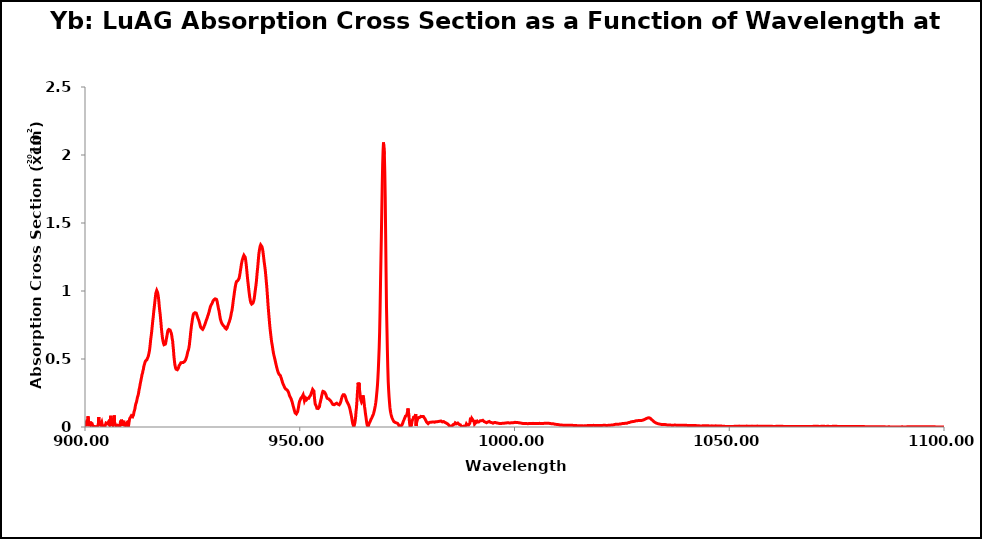
| Category | 175 K |
|---|---|
| 900.0 | 0.008 |
| 900.1 | 0.011 |
| 900.2 | 0.025 |
| 900.3 | 0.015 |
| 900.4 | 0.02 |
| 900.5 | 0.022 |
| 900.6 | 0.02 |
| 900.7 | 0.079 |
| 900.8 | 0.046 |
| 900.9 | 0.015 |
| 901.0 | 0.014 |
| 901.1 | 0.019 |
| 901.2 | 0.016 |
| 901.3 | 0.04 |
| 901.4 | 0.013 |
| 901.5 | 0.015 |
| 901.6 | 0.01 |
| 901.7 | 0.02 |
| 901.8 | 0.011 |
| 901.9 | 0.013 |
| 902.0 | 0.003 |
| 902.1 | 0.008 |
| 902.2 | 0.005 |
| 902.3 | 0.003 |
| 902.4 | 0.001 |
| 902.5 | 0.002 |
| 902.6 | 0.001 |
| 902.7 | 0.001 |
| 902.8 | 0 |
| 902.9 | 0.005 |
| 903.0 | 0.011 |
| 903.1 | 0.019 |
| 903.2 | 0.073 |
| 903.3 | 0.018 |
| 903.4 | 0.015 |
| 903.5 | 0.012 |
| 903.6 | 0.013 |
| 903.7 | 0.019 |
| 903.8 | 0.027 |
| 903.9 | 0.034 |
| 904.0 | 0.018 |
| 904.1 | 0.009 |
| 904.2 | 0.008 |
| 904.3 | 0.008 |
| 904.4 | 0.009 |
| 904.5 | 0.001 |
| 904.6 | 0.007 |
| 904.7 | 0.009 |
| 904.8 | 0.014 |
| 904.9 | 0.029 |
| 905.0 | 0.028 |
| 905.1 | 0.027 |
| 905.2 | 0.025 |
| 905.3 | 0.028 |
| 905.4 | 0.034 |
| 905.5 | 0.023 |
| 905.6 | 0.019 |
| 905.7 | 0.014 |
| 905.8 | 0.024 |
| 905.9 | 0.042 |
| 906.0 | 0.082 |
| 906.1 | 0.019 |
| 906.2 | 0.015 |
| 906.3 | 0.016 |
| 906.4 | 0.024 |
| 906.5 | 0.014 |
| 906.6 | 0.024 |
| 906.7 | 0.029 |
| 906.8 | 0.085 |
| 906.9 | 0.035 |
| 907.0 | 0.02 |
| 907.1 | 0.018 |
| 907.2 | 0.008 |
| 907.3 | 0.013 |
| 907.4 | 0.008 |
| 907.5 | 0.014 |
| 907.6 | 0.016 |
| 907.7 | 0.019 |
| 907.8 | 0.01 |
| 907.9 | 0.009 |
| 908.0 | 0.007 |
| 908.1 | 0.008 |
| 908.2 | 0.012 |
| 908.3 | 0.046 |
| 908.4 | 0.008 |
| 908.5 | 0.054 |
| 908.6 | 0.051 |
| 908.7 | 0.008 |
| 908.8 | 0.008 |
| 908.9 | 0.008 |
| 909.0 | 0.046 |
| 909.1 | 0.017 |
| 909.2 | 0.014 |
| 909.3 | 0.01 |
| 909.4 | 0.01 |
| 909.5 | 0.02 |
| 909.6 | 0.025 |
| 909.7 | 0.028 |
| 909.8 | 0.016 |
| 909.9 | 0.014 |
| 910.0 | 0.015 |
| 910.1 | 0.002 |
| 910.2 | 0 |
| 910.3 | 0.044 |
| 910.4 | 0.062 |
| 910.5 | 0.063 |
| 910.6 | 0.072 |
| 910.7 | 0.074 |
| 910.8 | 0.083 |
| 910.9 | 0.083 |
| 911.0 | 0.083 |
| 911.1 | 0.076 |
| 911.2 | 0.076 |
| 911.3 | 0.09 |
| 911.4 | 0.11 |
| 911.5 | 0.119 |
| 911.6 | 0.131 |
| 911.7 | 0.15 |
| 911.8 | 0.167 |
| 911.9 | 0.176 |
| 912.0 | 0.185 |
| 912.1 | 0.202 |
| 912.2 | 0.218 |
| 912.3 | 0.226 |
| 912.4 | 0.238 |
| 912.5 | 0.254 |
| 912.6 | 0.276 |
| 912.7 | 0.288 |
| 912.8 | 0.307 |
| 912.9 | 0.323 |
| 913.0 | 0.339 |
| 913.1 | 0.354 |
| 913.2 | 0.372 |
| 913.3 | 0.389 |
| 913.4 | 0.397 |
| 913.5 | 0.414 |
| 913.6 | 0.426 |
| 913.7 | 0.446 |
| 913.8 | 0.457 |
| 913.9 | 0.468 |
| 914.0 | 0.478 |
| 914.1 | 0.486 |
| 914.2 | 0.486 |
| 914.3 | 0.488 |
| 914.4 | 0.494 |
| 914.5 | 0.503 |
| 914.6 | 0.51 |
| 914.7 | 0.517 |
| 914.8 | 0.53 |
| 914.9 | 0.544 |
| 915.0 | 0.559 |
| 915.1 | 0.583 |
| 915.2 | 0.613 |
| 915.3 | 0.645 |
| 915.4 | 0.668 |
| 915.5 | 0.693 |
| 915.6 | 0.724 |
| 915.7 | 0.755 |
| 915.8 | 0.787 |
| 915.9 | 0.812 |
| 916.0 | 0.848 |
| 916.1 | 0.874 |
| 916.2 | 0.902 |
| 916.3 | 0.931 |
| 916.4 | 0.959 |
| 916.5 | 0.985 |
| 916.6 | 0.994 |
| 916.7 | 1.004 |
| 916.8 | 0.999 |
| 916.9 | 0.989 |
| 917.0 | 0.973 |
| 917.1 | 0.951 |
| 917.2 | 0.922 |
| 917.3 | 0.885 |
| 917.4 | 0.856 |
| 917.5 | 0.83 |
| 917.6 | 0.795 |
| 917.7 | 0.761 |
| 917.8 | 0.721 |
| 917.9 | 0.693 |
| 918.0 | 0.665 |
| 918.1 | 0.642 |
| 918.2 | 0.627 |
| 918.3 | 0.613 |
| 918.4 | 0.605 |
| 918.5 | 0.602 |
| 918.6 | 0.602 |
| 918.7 | 0.609 |
| 918.8 | 0.619 |
| 918.9 | 0.64 |
| 919.0 | 0.656 |
| 919.1 | 0.674 |
| 919.2 | 0.692 |
| 919.3 | 0.709 |
| 919.4 | 0.714 |
| 919.5 | 0.717 |
| 919.6 | 0.72 |
| 919.7 | 0.717 |
| 919.8 | 0.713 |
| 919.9 | 0.707 |
| 920.0 | 0.707 |
| 920.1 | 0.689 |
| 920.2 | 0.673 |
| 920.3 | 0.649 |
| 920.4 | 0.634 |
| 920.5 | 0.597 |
| 920.6 | 0.565 |
| 920.7 | 0.522 |
| 920.8 | 0.492 |
| 920.9 | 0.464 |
| 921.0 | 0.446 |
| 921.1 | 0.434 |
| 921.2 | 0.425 |
| 921.3 | 0.419 |
| 921.4 | 0.419 |
| 921.5 | 0.421 |
| 921.6 | 0.426 |
| 921.7 | 0.43 |
| 921.8 | 0.439 |
| 921.9 | 0.451 |
| 922.0 | 0.458 |
| 922.1 | 0.46 |
| 922.2 | 0.462 |
| 922.3 | 0.472 |
| 922.4 | 0.478 |
| 922.5 | 0.479 |
| 922.6 | 0.473 |
| 922.7 | 0.477 |
| 922.8 | 0.473 |
| 922.9 | 0.474 |
| 923.0 | 0.473 |
| 923.1 | 0.481 |
| 923.2 | 0.483 |
| 923.3 | 0.487 |
| 923.4 | 0.492 |
| 923.5 | 0.501 |
| 923.6 | 0.508 |
| 923.7 | 0.521 |
| 923.8 | 0.535 |
| 923.9 | 0.549 |
| 924.0 | 0.559 |
| 924.1 | 0.568 |
| 924.2 | 0.584 |
| 924.3 | 0.603 |
| 924.4 | 0.635 |
| 924.5 | 0.66 |
| 924.6 | 0.694 |
| 924.7 | 0.72 |
| 924.8 | 0.748 |
| 924.9 | 0.767 |
| 925.0 | 0.79 |
| 925.1 | 0.808 |
| 925.2 | 0.826 |
| 925.3 | 0.833 |
| 925.4 | 0.835 |
| 925.5 | 0.838 |
| 925.6 | 0.84 |
| 925.7 | 0.845 |
| 925.8 | 0.843 |
| 925.9 | 0.837 |
| 926.0 | 0.831 |
| 926.1 | 0.819 |
| 926.2 | 0.809 |
| 926.3 | 0.8 |
| 926.4 | 0.792 |
| 926.5 | 0.784 |
| 926.6 | 0.773 |
| 926.7 | 0.762 |
| 926.8 | 0.749 |
| 926.9 | 0.737 |
| 927.0 | 0.731 |
| 927.1 | 0.726 |
| 927.2 | 0.721 |
| 927.3 | 0.719 |
| 927.4 | 0.718 |
| 927.5 | 0.722 |
| 927.6 | 0.728 |
| 927.7 | 0.738 |
| 927.8 | 0.743 |
| 927.9 | 0.752 |
| 928.0 | 0.759 |
| 928.1 | 0.772 |
| 928.2 | 0.779 |
| 928.3 | 0.79 |
| 928.4 | 0.797 |
| 928.5 | 0.808 |
| 928.6 | 0.818 |
| 928.7 | 0.826 |
| 928.8 | 0.838 |
| 928.9 | 0.847 |
| 929.0 | 0.863 |
| 929.1 | 0.872 |
| 929.2 | 0.886 |
| 929.3 | 0.892 |
| 929.4 | 0.899 |
| 929.5 | 0.901 |
| 929.6 | 0.91 |
| 929.7 | 0.918 |
| 929.8 | 0.926 |
| 929.9 | 0.932 |
| 930.0 | 0.935 |
| 930.1 | 0.942 |
| 930.2 | 0.941 |
| 930.3 | 0.942 |
| 930.4 | 0.942 |
| 930.5 | 0.942 |
| 930.6 | 0.939 |
| 930.7 | 0.931 |
| 930.8 | 0.918 |
| 930.9 | 0.901 |
| 931.0 | 0.884 |
| 931.1 | 0.867 |
| 931.2 | 0.856 |
| 931.3 | 0.834 |
| 931.4 | 0.816 |
| 931.5 | 0.796 |
| 931.6 | 0.785 |
| 931.7 | 0.775 |
| 931.8 | 0.765 |
| 931.9 | 0.759 |
| 932.0 | 0.755 |
| 932.1 | 0.752 |
| 932.2 | 0.745 |
| 932.3 | 0.744 |
| 932.4 | 0.741 |
| 932.5 | 0.737 |
| 932.6 | 0.728 |
| 932.7 | 0.723 |
| 932.8 | 0.722 |
| 932.9 | 0.721 |
| 933.0 | 0.725 |
| 933.1 | 0.729 |
| 933.2 | 0.741 |
| 933.3 | 0.748 |
| 933.4 | 0.756 |
| 933.5 | 0.766 |
| 933.6 | 0.774 |
| 933.7 | 0.785 |
| 933.8 | 0.794 |
| 933.9 | 0.808 |
| 934.0 | 0.824 |
| 934.1 | 0.842 |
| 934.2 | 0.854 |
| 934.3 | 0.874 |
| 934.4 | 0.896 |
| 934.5 | 0.924 |
| 934.6 | 0.946 |
| 934.7 | 0.968 |
| 934.8 | 0.993 |
| 934.9 | 1.013 |
| 935.0 | 1.033 |
| 935.1 | 1.049 |
| 935.2 | 1.062 |
| 935.3 | 1.07 |
| 935.4 | 1.074 |
| 935.5 | 1.076 |
| 935.6 | 1.077 |
| 935.7 | 1.076 |
| 935.8 | 1.083 |
| 935.9 | 1.095 |
| 936.0 | 1.113 |
| 936.1 | 1.13 |
| 936.2 | 1.153 |
| 936.3 | 1.172 |
| 936.4 | 1.194 |
| 936.5 | 1.21 |
| 936.6 | 1.226 |
| 936.7 | 1.234 |
| 936.8 | 1.247 |
| 936.9 | 1.255 |
| 937.0 | 1.263 |
| 937.1 | 1.263 |
| 937.2 | 1.26 |
| 937.3 | 1.248 |
| 937.4 | 1.229 |
| 937.5 | 1.204 |
| 937.6 | 1.175 |
| 937.7 | 1.14 |
| 937.8 | 1.107 |
| 937.9 | 1.076 |
| 938.0 | 1.05 |
| 938.1 | 1.02 |
| 938.2 | 0.992 |
| 938.3 | 0.968 |
| 938.4 | 0.946 |
| 938.5 | 0.928 |
| 938.6 | 0.915 |
| 938.7 | 0.908 |
| 938.8 | 0.904 |
| 938.9 | 0.903 |
| 939.0 | 0.905 |
| 939.1 | 0.911 |
| 939.2 | 0.919 |
| 939.3 | 0.93 |
| 939.4 | 0.946 |
| 939.5 | 0.968 |
| 939.6 | 0.995 |
| 939.7 | 1.018 |
| 939.8 | 1.041 |
| 939.9 | 1.07 |
| 940.0 | 1.106 |
| 940.1 | 1.142 |
| 940.2 | 1.171 |
| 940.3 | 1.207 |
| 940.4 | 1.244 |
| 940.5 | 1.278 |
| 940.6 | 1.298 |
| 940.7 | 1.316 |
| 940.8 | 1.331 |
| 940.9 | 1.339 |
| 941.0 | 1.338 |
| 941.1 | 1.333 |
| 941.2 | 1.326 |
| 941.3 | 1.314 |
| 941.4 | 1.296 |
| 941.5 | 1.272 |
| 941.6 | 1.245 |
| 941.7 | 1.218 |
| 941.8 | 1.194 |
| 941.9 | 1.172 |
| 942.0 | 1.143 |
| 942.1 | 1.111 |
| 942.2 | 1.074 |
| 942.3 | 1.039 |
| 942.4 | 0.997 |
| 942.5 | 0.954 |
| 942.6 | 0.904 |
| 942.7 | 0.865 |
| 942.8 | 0.826 |
| 942.9 | 0.79 |
| 943.0 | 0.751 |
| 943.1 | 0.72 |
| 943.2 | 0.693 |
| 943.3 | 0.665 |
| 943.4 | 0.638 |
| 943.5 | 0.617 |
| 943.6 | 0.599 |
| 943.7 | 0.578 |
| 943.8 | 0.558 |
| 943.9 | 0.54 |
| 944.0 | 0.525 |
| 944.1 | 0.513 |
| 944.2 | 0.499 |
| 944.3 | 0.486 |
| 944.4 | 0.47 |
| 944.5 | 0.457 |
| 944.6 | 0.444 |
| 944.7 | 0.432 |
| 944.8 | 0.419 |
| 944.9 | 0.408 |
| 945.0 | 0.399 |
| 945.1 | 0.393 |
| 945.2 | 0.386 |
| 945.3 | 0.385 |
| 945.4 | 0.381 |
| 945.5 | 0.377 |
| 945.6 | 0.367 |
| 945.7 | 0.358 |
| 945.8 | 0.348 |
| 945.9 | 0.338 |
| 946.0 | 0.326 |
| 946.1 | 0.318 |
| 946.2 | 0.311 |
| 946.3 | 0.304 |
| 946.4 | 0.297 |
| 946.5 | 0.289 |
| 946.6 | 0.286 |
| 946.7 | 0.28 |
| 946.8 | 0.276 |
| 946.9 | 0.273 |
| 947.0 | 0.274 |
| 947.1 | 0.271 |
| 947.2 | 0.266 |
| 947.3 | 0.259 |
| 947.4 | 0.253 |
| 947.5 | 0.243 |
| 947.6 | 0.232 |
| 947.7 | 0.225 |
| 947.8 | 0.22 |
| 947.9 | 0.214 |
| 948.0 | 0.206 |
| 948.1 | 0.196 |
| 948.2 | 0.188 |
| 948.3 | 0.176 |
| 948.4 | 0.163 |
| 948.5 | 0.151 |
| 948.6 | 0.14 |
| 948.7 | 0.127 |
| 948.8 | 0.117 |
| 948.9 | 0.105 |
| 949.0 | 0.104 |
| 949.1 | 0.1 |
| 949.2 | 0.096 |
| 949.3 | 0.092 |
| 949.4 | 0.095 |
| 949.5 | 0.112 |
| 949.6 | 0.127 |
| 949.7 | 0.144 |
| 949.8 | 0.165 |
| 949.9 | 0.181 |
| 950.0 | 0.192 |
| 950.1 | 0.198 |
| 950.2 | 0.206 |
| 950.3 | 0.214 |
| 950.4 | 0.22 |
| 950.5 | 0.22 |
| 950.6 | 0.224 |
| 950.7 | 0.228 |
| 950.8 | 0.237 |
| 950.9 | 0.224 |
| 951.0 | 0.207 |
| 951.1 | 0.192 |
| 951.2 | 0.199 |
| 951.3 | 0.205 |
| 951.4 | 0.212 |
| 951.5 | 0.207 |
| 951.6 | 0.202 |
| 951.7 | 0.2 |
| 951.8 | 0.21 |
| 951.9 | 0.211 |
| 952.0 | 0.213 |
| 952.1 | 0.211 |
| 952.2 | 0.22 |
| 952.3 | 0.224 |
| 952.4 | 0.226 |
| 952.5 | 0.232 |
| 952.6 | 0.24 |
| 952.7 | 0.247 |
| 952.8 | 0.259 |
| 952.9 | 0.266 |
| 953.0 | 0.276 |
| 953.1 | 0.269 |
| 953.2 | 0.271 |
| 953.3 | 0.263 |
| 953.4 | 0.225 |
| 953.5 | 0.193 |
| 953.6 | 0.169 |
| 953.7 | 0.169 |
| 953.8 | 0.156 |
| 953.9 | 0.148 |
| 954.0 | 0.137 |
| 954.1 | 0.137 |
| 954.2 | 0.134 |
| 954.3 | 0.136 |
| 954.4 | 0.132 |
| 954.5 | 0.143 |
| 954.6 | 0.15 |
| 954.7 | 0.173 |
| 954.8 | 0.183 |
| 954.9 | 0.199 |
| 955.0 | 0.209 |
| 955.1 | 0.228 |
| 955.2 | 0.24 |
| 955.3 | 0.254 |
| 955.4 | 0.262 |
| 955.5 | 0.267 |
| 955.6 | 0.265 |
| 955.7 | 0.259 |
| 955.8 | 0.255 |
| 955.9 | 0.25 |
| 956.0 | 0.244 |
| 956.1 | 0.237 |
| 956.2 | 0.225 |
| 956.3 | 0.219 |
| 956.4 | 0.211 |
| 956.5 | 0.209 |
| 956.6 | 0.208 |
| 956.7 | 0.207 |
| 956.8 | 0.202 |
| 956.9 | 0.2 |
| 957.0 | 0.198 |
| 957.1 | 0.198 |
| 957.2 | 0.193 |
| 957.3 | 0.188 |
| 957.4 | 0.183 |
| 957.5 | 0.176 |
| 957.6 | 0.171 |
| 957.7 | 0.166 |
| 957.8 | 0.165 |
| 957.9 | 0.163 |
| 958.0 | 0.164 |
| 958.1 | 0.163 |
| 958.2 | 0.167 |
| 958.3 | 0.17 |
| 958.4 | 0.175 |
| 958.5 | 0.174 |
| 958.6 | 0.175 |
| 958.7 | 0.169 |
| 958.8 | 0.171 |
| 958.9 | 0.167 |
| 959.0 | 0.167 |
| 959.1 | 0.163 |
| 959.2 | 0.163 |
| 959.3 | 0.168 |
| 959.4 | 0.173 |
| 959.5 | 0.183 |
| 959.6 | 0.191 |
| 959.7 | 0.206 |
| 959.8 | 0.215 |
| 959.9 | 0.225 |
| 960.0 | 0.23 |
| 960.1 | 0.237 |
| 960.2 | 0.24 |
| 960.3 | 0.239 |
| 960.4 | 0.236 |
| 960.5 | 0.231 |
| 960.6 | 0.225 |
| 960.7 | 0.214 |
| 960.8 | 0.204 |
| 960.9 | 0.193 |
| 961.0 | 0.185 |
| 961.1 | 0.181 |
| 961.2 | 0.174 |
| 961.3 | 0.168 |
| 961.4 | 0.161 |
| 961.5 | 0.153 |
| 961.6 | 0.144 |
| 961.7 | 0.13 |
| 961.8 | 0.115 |
| 961.9 | 0.1 |
| 962.0 | 0.085 |
| 962.1 | 0.068 |
| 962.2 | 0.048 |
| 962.3 | 0.031 |
| 962.4 | 0.019 |
| 962.5 | 0.009 |
| 962.6 | 0 |
| 962.7 | 0.013 |
| 962.8 | 0.025 |
| 962.9 | 0.044 |
| 963.0 | 0.071 |
| 963.1 | 0.112 |
| 963.2 | 0.14 |
| 963.3 | 0.183 |
| 963.4 | 0.238 |
| 963.5 | 0.282 |
| 963.6 | 0.326 |
| 963.7 | 0.306 |
| 963.8 | 0.325 |
| 963.9 | 0.278 |
| 964.0 | 0.253 |
| 964.1 | 0.225 |
| 964.2 | 0.201 |
| 964.3 | 0.191 |
| 964.4 | 0.182 |
| 964.5 | 0.184 |
| 964.6 | 0.194 |
| 964.7 | 0.232 |
| 964.8 | 0.237 |
| 964.9 | 0.203 |
| 965.0 | 0.174 |
| 965.1 | 0.147 |
| 965.2 | 0.125 |
| 965.3 | 0.097 |
| 965.4 | 0.078 |
| 965.5 | 0.053 |
| 965.6 | 0.03 |
| 965.7 | 0.015 |
| 965.8 | 0.008 |
| 965.9 | 0.001 |
| 966.0 | 0.008 |
| 966.1 | 0.02 |
| 966.2 | 0.029 |
| 966.3 | 0.035 |
| 966.4 | 0.042 |
| 966.5 | 0.049 |
| 966.6 | 0.057 |
| 966.7 | 0.063 |
| 966.8 | 0.069 |
| 966.9 | 0.076 |
| 967.0 | 0.083 |
| 967.1 | 0.091 |
| 967.2 | 0.1 |
| 967.3 | 0.113 |
| 967.4 | 0.125 |
| 967.5 | 0.142 |
| 967.6 | 0.159 |
| 967.7 | 0.179 |
| 967.8 | 0.205 |
| 967.9 | 0.237 |
| 968.0 | 0.271 |
| 968.1 | 0.309 |
| 968.2 | 0.363 |
| 968.3 | 0.425 |
| 968.4 | 0.505 |
| 968.5 | 0.588 |
| 968.6 | 0.701 |
| 968.7 | 0.857 |
| 968.8 | 1.049 |
| 968.9 | 1.227 |
| 969.0 | 1.4 |
| 969.1 | 1.586 |
| 969.2 | 1.77 |
| 969.3 | 1.926 |
| 969.4 | 2.03 |
| 969.5 | 2.092 |
| 969.6 | 2.092 |
| 969.7 | 2.004 |
| 969.8 | 1.876 |
| 969.9 | 1.693 |
| 970.0 | 1.417 |
| 970.1 | 1.134 |
| 970.2 | 0.879 |
| 970.3 | 0.723 |
| 970.4 | 0.566 |
| 970.5 | 0.437 |
| 970.6 | 0.333 |
| 970.7 | 0.271 |
| 970.8 | 0.221 |
| 970.9 | 0.179 |
| 971.0 | 0.142 |
| 971.1 | 0.117 |
| 971.2 | 0.101 |
| 971.3 | 0.087 |
| 971.4 | 0.075 |
| 971.5 | 0.066 |
| 971.6 | 0.059 |
| 971.7 | 0.053 |
| 971.8 | 0.046 |
| 971.9 | 0.041 |
| 972.0 | 0.038 |
| 972.1 | 0.035 |
| 972.2 | 0.033 |
| 972.3 | 0.032 |
| 972.4 | 0.031 |
| 972.5 | 0.03 |
| 972.6 | 0.03 |
| 972.7 | 0.029 |
| 972.8 | 0.027 |
| 972.9 | 0.022 |
| 973.0 | 0.017 |
| 973.1 | 0.01 |
| 973.2 | 0.002 |
| 973.3 | 0.002 |
| 973.4 | 0.003 |
| 973.5 | 0.005 |
| 973.6 | 0.009 |
| 973.7 | 0.013 |
| 973.8 | 0.016 |
| 973.9 | 0.022 |
| 974.0 | 0.029 |
| 974.1 | 0.041 |
| 974.2 | 0.046 |
| 974.3 | 0.055 |
| 974.4 | 0.06 |
| 974.5 | 0.071 |
| 974.6 | 0.08 |
| 974.7 | 0.085 |
| 974.8 | 0.086 |
| 974.9 | 0.086 |
| 975.0 | 0.1 |
| 975.1 | 0.112 |
| 975.2 | 0.136 |
| 975.3 | 0.111 |
| 975.4 | 0.093 |
| 975.5 | 0.052 |
| 975.6 | 0.022 |
| 975.7 | 0.001 |
| 975.8 | 0.002 |
| 975.9 | 0.001 |
| 976.0 | 0.011 |
| 976.1 | 0.033 |
| 976.2 | 0.05 |
| 976.3 | 0.055 |
| 976.4 | 0.06 |
| 976.5 | 0.072 |
| 976.6 | 0.077 |
| 976.7 | 0.077 |
| 976.8 | 0.075 |
| 976.9 | 0.085 |
| 977.0 | 0.095 |
| 977.1 | 0.007 |
| 977.2 | 0.03 |
| 977.3 | 0.045 |
| 977.4 | 0.053 |
| 977.5 | 0.06 |
| 977.6 | 0.069 |
| 977.7 | 0.068 |
| 977.8 | 0.071 |
| 977.9 | 0.07 |
| 978.0 | 0.072 |
| 978.1 | 0.073 |
| 978.2 | 0.078 |
| 978.3 | 0.077 |
| 978.4 | 0.08 |
| 978.5 | 0.077 |
| 978.6 | 0.08 |
| 978.7 | 0.08 |
| 978.8 | 0.077 |
| 978.9 | 0.074 |
| 979.0 | 0.067 |
| 979.1 | 0.065 |
| 979.2 | 0.058 |
| 979.3 | 0.053 |
| 979.4 | 0.044 |
| 979.5 | 0.038 |
| 979.6 | 0.033 |
| 979.7 | 0.029 |
| 979.8 | 0.027 |
| 979.9 | 0.025 |
| 980.0 | 0.026 |
| 980.1 | 0.03 |
| 980.2 | 0.034 |
| 980.3 | 0.035 |
| 980.4 | 0.034 |
| 980.5 | 0.035 |
| 980.6 | 0.037 |
| 980.7 | 0.036 |
| 980.8 | 0.037 |
| 980.9 | 0.037 |
| 981.0 | 0.038 |
| 981.1 | 0.037 |
| 981.2 | 0.036 |
| 981.3 | 0.035 |
| 981.4 | 0.035 |
| 981.5 | 0.035 |
| 981.6 | 0.037 |
| 981.7 | 0.039 |
| 981.8 | 0.039 |
| 981.9 | 0.039 |
| 982.0 | 0.039 |
| 982.1 | 0.039 |
| 982.2 | 0.038 |
| 982.3 | 0.04 |
| 982.4 | 0.042 |
| 982.5 | 0.044 |
| 982.6 | 0.042 |
| 982.7 | 0.044 |
| 982.8 | 0.045 |
| 982.9 | 0.044 |
| 983.0 | 0.04 |
| 983.1 | 0.039 |
| 983.2 | 0.037 |
| 983.3 | 0.039 |
| 983.4 | 0.038 |
| 983.5 | 0.04 |
| 983.6 | 0.039 |
| 983.7 | 0.036 |
| 983.8 | 0.034 |
| 983.9 | 0.032 |
| 984.0 | 0.032 |
| 984.1 | 0.029 |
| 984.2 | 0.029 |
| 984.3 | 0.027 |
| 984.4 | 0.023 |
| 984.5 | 0.02 |
| 984.6 | 0.017 |
| 984.7 | 0.015 |
| 984.8 | 0.012 |
| 984.9 | 0.006 |
| 985.0 | 0.003 |
| 985.1 | 0.004 |
| 985.2 | 0.006 |
| 985.3 | 0.01 |
| 985.4 | 0.006 |
| 985.5 | 0.009 |
| 985.6 | 0.01 |
| 985.7 | 0.018 |
| 985.8 | 0.018 |
| 985.9 | 0.018 |
| 986.0 | 0.02 |
| 986.1 | 0.024 |
| 986.2 | 0.031 |
| 986.3 | 0.029 |
| 986.4 | 0.03 |
| 986.5 | 0.024 |
| 986.6 | 0.028 |
| 986.7 | 0.025 |
| 986.8 | 0.029 |
| 986.9 | 0.026 |
| 987.0 | 0.025 |
| 987.1 | 0.019 |
| 987.2 | 0.019 |
| 987.3 | 0.02 |
| 987.4 | 0.016 |
| 987.5 | 0.012 |
| 987.6 | 0.006 |
| 987.7 | 0 |
| 987.8 | 0.002 |
| 987.9 | 0.002 |
| 988.0 | 0.008 |
| 988.1 | 0.009 |
| 988.2 | 0.006 |
| 988.3 | 0.004 |
| 988.4 | 0.001 |
| 988.5 | 0.002 |
| 988.6 | 0.006 |
| 988.7 | 0.015 |
| 988.8 | 0.023 |
| 988.9 | 0.019 |
| 989.0 | 0.014 |
| 989.1 | 0.009 |
| 989.2 | 0.012 |
| 989.3 | 0.015 |
| 989.4 | 0.016 |
| 989.5 | 0.016 |
| 989.6 | 0.028 |
| 989.7 | 0.056 |
| 989.8 | 0.069 |
| 989.9 | 0.063 |
| 990.0 | 0.039 |
| 990.1 | 0.061 |
| 990.2 | 0.064 |
| 990.3 | 0.052 |
| 990.4 | 0.048 |
| 990.5 | 0.05 |
| 990.6 | 0.037 |
| 990.7 | 0.021 |
| 990.8 | 0.02 |
| 990.9 | 0.021 |
| 991.0 | 0.032 |
| 991.1 | 0.052 |
| 991.2 | 0.044 |
| 991.3 | 0.04 |
| 991.4 | 0.036 |
| 991.5 | 0.043 |
| 991.6 | 0.039 |
| 991.7 | 0.037 |
| 991.8 | 0.036 |
| 991.9 | 0.043 |
| 992.0 | 0.046 |
| 992.1 | 0.048 |
| 992.2 | 0.046 |
| 992.3 | 0.046 |
| 992.4 | 0.049 |
| 992.5 | 0.051 |
| 992.6 | 0.049 |
| 992.7 | 0.044 |
| 992.8 | 0.042 |
| 992.9 | 0.04 |
| 993.0 | 0.041 |
| 993.1 | 0.037 |
| 993.2 | 0.036 |
| 993.3 | 0.034 |
| 993.4 | 0.033 |
| 993.5 | 0.032 |
| 993.6 | 0.033 |
| 993.7 | 0.035 |
| 993.8 | 0.037 |
| 993.9 | 0.039 |
| 994.0 | 0.04 |
| 994.1 | 0.041 |
| 994.2 | 0.039 |
| 994.3 | 0.038 |
| 994.4 | 0.034 |
| 994.5 | 0.032 |
| 994.6 | 0.032 |
| 994.7 | 0.032 |
| 994.8 | 0.032 |
| 994.9 | 0.029 |
| 995.0 | 0.028 |
| 995.1 | 0.029 |
| 995.2 | 0.032 |
| 995.3 | 0.033 |
| 995.4 | 0.032 |
| 995.5 | 0.033 |
| 995.6 | 0.033 |
| 995.7 | 0.034 |
| 995.8 | 0.031 |
| 995.9 | 0.029 |
| 996.0 | 0.028 |
| 996.1 | 0.027 |
| 996.2 | 0.028 |
| 996.3 | 0.027 |
| 996.4 | 0.026 |
| 996.5 | 0.026 |
| 996.6 | 0.027 |
| 996.7 | 0.026 |
| 996.8 | 0.026 |
| 996.9 | 0.026 |
| 997.0 | 0.027 |
| 997.1 | 0.027 |
| 997.2 | 0.027 |
| 997.3 | 0.028 |
| 997.4 | 0.028 |
| 997.5 | 0.03 |
| 997.6 | 0.029 |
| 997.7 | 0.028 |
| 997.8 | 0.028 |
| 997.9 | 0.029 |
| 998.0 | 0.029 |
| 998.1 | 0.03 |
| 998.2 | 0.031 |
| 998.3 | 0.031 |
| 998.4 | 0.031 |
| 998.5 | 0.031 |
| 998.6 | 0.031 |
| 998.7 | 0.029 |
| 998.8 | 0.029 |
| 998.9 | 0.029 |
| 999.0 | 0.031 |
| 999.1 | 0.031 |
| 999.2 | 0.031 |
| 999.3 | 0.031 |
| 999.4 | 0.031 |
| 999.5 | 0.032 |
| 999.6 | 0.033 |
| 999.7 | 0.033 |
| 999.8 | 0.032 |
| 999.9 | 0.033 |
| 1000.0 | 0.033 |
| 1000.1 | 0.034 |
| 1000.2 | 0.034 |
| 1000.3 | 0.034 |
| 1000.4 | 0.033 |
| 1000.5 | 0.033 |
| 1000.6 | 0.034 |
| 1000.7 | 0.033 |
| 1000.8 | 0.032 |
| 1000.9 | 0.031 |
| 1001.0 | 0.031 |
| 1001.1 | 0.031 |
| 1001.2 | 0.031 |
| 1001.3 | 0.03 |
| 1001.4 | 0.029 |
| 1001.5 | 0.029 |
| 1001.6 | 0.028 |
| 1001.7 | 0.027 |
| 1001.8 | 0.026 |
| 1001.9 | 0.026 |
| 1002.0 | 0.026 |
| 1002.1 | 0.026 |
| 1002.2 | 0.025 |
| 1002.3 | 0.025 |
| 1002.4 | 0.025 |
| 1002.5 | 0.026 |
| 1002.6 | 0.026 |
| 1002.7 | 0.026 |
| 1002.8 | 0.025 |
| 1002.9 | 0.025 |
| 1003.0 | 0.025 |
| 1003.1 | 0.024 |
| 1003.2 | 0.025 |
| 1003.3 | 0.025 |
| 1003.4 | 0.025 |
| 1003.5 | 0.025 |
| 1003.6 | 0.026 |
| 1003.7 | 0.026 |
| 1003.8 | 0.026 |
| 1003.9 | 0.026 |
| 1004.0 | 0.026 |
| 1004.1 | 0.025 |
| 1004.2 | 0.026 |
| 1004.3 | 0.027 |
| 1004.4 | 0.027 |
| 1004.5 | 0.027 |
| 1004.6 | 0.025 |
| 1004.7 | 0.025 |
| 1004.8 | 0.025 |
| 1004.9 | 0.026 |
| 1005.0 | 0.027 |
| 1005.1 | 0.027 |
| 1005.2 | 0.026 |
| 1005.3 | 0.026 |
| 1005.4 | 0.026 |
| 1005.5 | 0.026 |
| 1005.6 | 0.026 |
| 1005.7 | 0.027 |
| 1005.8 | 0.027 |
| 1005.9 | 0.026 |
| 1006.0 | 0.026 |
| 1006.1 | 0.025 |
| 1006.2 | 0.025 |
| 1006.3 | 0.025 |
| 1006.4 | 0.025 |
| 1006.5 | 0.025 |
| 1006.6 | 0.026 |
| 1006.7 | 0.026 |
| 1006.8 | 0.027 |
| 1006.9 | 0.027 |
| 1007.0 | 0.028 |
| 1007.1 | 0.028 |
| 1007.2 | 0.028 |
| 1007.3 | 0.028 |
| 1007.4 | 0.028 |
| 1007.5 | 0.028 |
| 1007.6 | 0.027 |
| 1007.7 | 0.028 |
| 1007.8 | 0.028 |
| 1007.9 | 0.028 |
| 1008.0 | 0.027 |
| 1008.1 | 0.027 |
| 1008.2 | 0.026 |
| 1008.3 | 0.026 |
| 1008.4 | 0.025 |
| 1008.5 | 0.025 |
| 1008.6 | 0.025 |
| 1008.7 | 0.025 |
| 1008.8 | 0.024 |
| 1008.9 | 0.024 |
| 1009.0 | 0.023 |
| 1009.1 | 0.023 |
| 1009.2 | 0.022 |
| 1009.3 | 0.021 |
| 1009.4 | 0.02 |
| 1009.5 | 0.02 |
| 1009.6 | 0.02 |
| 1009.7 | 0.019 |
| 1009.8 | 0.019 |
| 1009.9 | 0.019 |
| 1010.0 | 0.018 |
| 1010.1 | 0.018 |
| 1010.2 | 0.018 |
| 1010.3 | 0.017 |
| 1010.4 | 0.017 |
| 1010.5 | 0.015 |
| 1010.6 | 0.015 |
| 1010.7 | 0.014 |
| 1010.8 | 0.014 |
| 1010.9 | 0.014 |
| 1011.0 | 0.014 |
| 1011.1 | 0.014 |
| 1011.2 | 0.014 |
| 1011.3 | 0.014 |
| 1011.4 | 0.014 |
| 1011.5 | 0.013 |
| 1011.6 | 0.013 |
| 1011.7 | 0.013 |
| 1011.8 | 0.014 |
| 1011.9 | 0.014 |
| 1012.0 | 0.014 |
| 1012.1 | 0.013 |
| 1012.2 | 0.013 |
| 1012.3 | 0.014 |
| 1012.4 | 0.014 |
| 1012.5 | 0.014 |
| 1012.6 | 0.014 |
| 1012.7 | 0.014 |
| 1012.8 | 0.013 |
| 1012.9 | 0.013 |
| 1013.0 | 0.013 |
| 1013.1 | 0.013 |
| 1013.2 | 0.013 |
| 1013.3 | 0.013 |
| 1013.4 | 0.012 |
| 1013.5 | 0.012 |
| 1013.6 | 0.012 |
| 1013.7 | 0.012 |
| 1013.8 | 0.012 |
| 1013.9 | 0.011 |
| 1014.0 | 0.011 |
| 1014.1 | 0.011 |
| 1014.2 | 0.011 |
| 1014.3 | 0.011 |
| 1014.4 | 0.01 |
| 1014.5 | 0.01 |
| 1014.6 | 0.01 |
| 1014.7 | 0.01 |
| 1014.8 | 0.01 |
| 1014.9 | 0.01 |
| 1015.0 | 0.009 |
| 1015.1 | 0.009 |
| 1015.2 | 0.009 |
| 1015.3 | 0.009 |
| 1015.4 | 0.009 |
| 1015.5 | 0.01 |
| 1015.6 | 0.009 |
| 1015.7 | 0.009 |
| 1015.8 | 0.009 |
| 1015.9 | 0.009 |
| 1016.0 | 0.008 |
| 1016.1 | 0.008 |
| 1016.2 | 0.009 |
| 1016.3 | 0.009 |
| 1016.4 | 0.009 |
| 1016.5 | 0.009 |
| 1016.6 | 0.009 |
| 1016.7 | 0.009 |
| 1016.8 | 0.009 |
| 1016.9 | 0.01 |
| 1017.0 | 0.01 |
| 1017.1 | 0.011 |
| 1017.2 | 0.012 |
| 1017.3 | 0.012 |
| 1017.4 | 0.011 |
| 1017.5 | 0.011 |
| 1017.6 | 0.01 |
| 1017.7 | 0.011 |
| 1017.8 | 0.011 |
| 1017.9 | 0.011 |
| 1018.0 | 0.011 |
| 1018.1 | 0.011 |
| 1018.2 | 0.011 |
| 1018.3 | 0.012 |
| 1018.4 | 0.012 |
| 1018.5 | 0.012 |
| 1018.6 | 0.012 |
| 1018.7 | 0.012 |
| 1018.8 | 0.012 |
| 1018.9 | 0.011 |
| 1019.0 | 0.011 |
| 1019.1 | 0.011 |
| 1019.2 | 0.011 |
| 1019.3 | 0.011 |
| 1019.4 | 0.011 |
| 1019.5 | 0.011 |
| 1019.6 | 0.011 |
| 1019.7 | 0.012 |
| 1019.8 | 0.012 |
| 1019.9 | 0.012 |
| 1020.0 | 0.012 |
| 1020.1 | 0.012 |
| 1020.2 | 0.012 |
| 1020.3 | 0.012 |
| 1020.4 | 0.012 |
| 1020.5 | 0.012 |
| 1020.6 | 0.012 |
| 1020.7 | 0.012 |
| 1020.8 | 0.013 |
| 1020.9 | 0.013 |
| 1021.0 | 0.013 |
| 1021.1 | 0.012 |
| 1021.2 | 0.012 |
| 1021.3 | 0.012 |
| 1021.4 | 0.011 |
| 1021.5 | 0.011 |
| 1021.6 | 0.011 |
| 1021.7 | 0.012 |
| 1021.8 | 0.012 |
| 1021.9 | 0.013 |
| 1022.0 | 0.013 |
| 1022.1 | 0.013 |
| 1022.2 | 0.013 |
| 1022.3 | 0.013 |
| 1022.4 | 0.014 |
| 1022.5 | 0.014 |
| 1022.6 | 0.014 |
| 1022.7 | 0.015 |
| 1022.8 | 0.015 |
| 1022.9 | 0.015 |
| 1023.0 | 0.016 |
| 1023.1 | 0.016 |
| 1023.2 | 0.017 |
| 1023.3 | 0.019 |
| 1023.4 | 0.019 |
| 1023.5 | 0.02 |
| 1023.6 | 0.02 |
| 1023.7 | 0.02 |
| 1023.8 | 0.02 |
| 1023.9 | 0.02 |
| 1024.0 | 0.019 |
| 1024.1 | 0.02 |
| 1024.2 | 0.02 |
| 1024.3 | 0.021 |
| 1024.4 | 0.021 |
| 1024.5 | 0.022 |
| 1024.6 | 0.022 |
| 1024.7 | 0.022 |
| 1024.8 | 0.023 |
| 1024.9 | 0.024 |
| 1025.0 | 0.025 |
| 1025.1 | 0.025 |
| 1025.2 | 0.025 |
| 1025.3 | 0.026 |
| 1025.4 | 0.026 |
| 1025.5 | 0.027 |
| 1025.6 | 0.026 |
| 1025.7 | 0.027 |
| 1025.8 | 0.027 |
| 1025.9 | 0.028 |
| 1026.0 | 0.028 |
| 1026.1 | 0.028 |
| 1026.2 | 0.028 |
| 1026.3 | 0.029 |
| 1026.4 | 0.031 |
| 1026.5 | 0.032 |
| 1026.6 | 0.033 |
| 1026.7 | 0.033 |
| 1026.8 | 0.034 |
| 1026.9 | 0.035 |
| 1027.0 | 0.037 |
| 1027.1 | 0.038 |
| 1027.2 | 0.038 |
| 1027.3 | 0.038 |
| 1027.4 | 0.039 |
| 1027.5 | 0.04 |
| 1027.6 | 0.04 |
| 1027.7 | 0.04 |
| 1027.8 | 0.041 |
| 1027.9 | 0.042 |
| 1028.0 | 0.042 |
| 1028.1 | 0.044 |
| 1028.2 | 0.045 |
| 1028.3 | 0.046 |
| 1028.4 | 0.046 |
| 1028.5 | 0.046 |
| 1028.6 | 0.046 |
| 1028.7 | 0.047 |
| 1028.8 | 0.047 |
| 1028.9 | 0.048 |
| 1029.0 | 0.047 |
| 1029.1 | 0.047 |
| 1029.2 | 0.047 |
| 1029.3 | 0.048 |
| 1029.4 | 0.048 |
| 1029.5 | 0.048 |
| 1029.6 | 0.048 |
| 1029.7 | 0.049 |
| 1029.8 | 0.049 |
| 1029.9 | 0.05 |
| 1030.0 | 0.051 |
| 1030.1 | 0.053 |
| 1030.2 | 0.055 |
| 1030.3 | 0.056 |
| 1030.4 | 0.057 |
| 1030.5 | 0.058 |
| 1030.6 | 0.06 |
| 1030.7 | 0.062 |
| 1030.8 | 0.064 |
| 1030.9 | 0.065 |
| 1031.0 | 0.066 |
| 1031.1 | 0.067 |
| 1031.2 | 0.068 |
| 1031.3 | 0.068 |
| 1031.4 | 0.067 |
| 1031.5 | 0.066 |
| 1031.6 | 0.064 |
| 1031.7 | 0.062 |
| 1031.8 | 0.059 |
| 1031.9 | 0.056 |
| 1032.0 | 0.053 |
| 1032.1 | 0.05 |
| 1032.2 | 0.047 |
| 1032.3 | 0.043 |
| 1032.4 | 0.041 |
| 1032.5 | 0.039 |
| 1032.6 | 0.036 |
| 1032.7 | 0.034 |
| 1032.8 | 0.032 |
| 1032.9 | 0.03 |
| 1033.0 | 0.029 |
| 1033.1 | 0.028 |
| 1033.2 | 0.027 |
| 1033.3 | 0.026 |
| 1033.4 | 0.024 |
| 1033.5 | 0.023 |
| 1033.6 | 0.023 |
| 1033.7 | 0.022 |
| 1033.8 | 0.022 |
| 1033.9 | 0.021 |
| 1034.0 | 0.02 |
| 1034.1 | 0.02 |
| 1034.2 | 0.019 |
| 1034.3 | 0.018 |
| 1034.4 | 0.018 |
| 1034.5 | 0.018 |
| 1034.6 | 0.018 |
| 1034.7 | 0.018 |
| 1034.8 | 0.018 |
| 1034.9 | 0.018 |
| 1035.0 | 0.018 |
| 1035.1 | 0.017 |
| 1035.2 | 0.017 |
| 1035.3 | 0.017 |
| 1035.4 | 0.016 |
| 1035.5 | 0.016 |
| 1035.6 | 0.015 |
| 1035.7 | 0.015 |
| 1035.8 | 0.015 |
| 1035.9 | 0.015 |
| 1036.0 | 0.015 |
| 1036.1 | 0.015 |
| 1036.2 | 0.014 |
| 1036.3 | 0.014 |
| 1036.4 | 0.014 |
| 1036.5 | 0.014 |
| 1036.6 | 0.013 |
| 1036.7 | 0.013 |
| 1036.8 | 0.013 |
| 1036.9 | 0.013 |
| 1037.0 | 0.014 |
| 1037.1 | 0.014 |
| 1037.2 | 0.014 |
| 1037.3 | 0.014 |
| 1037.4 | 0.014 |
| 1037.5 | 0.014 |
| 1037.6 | 0.014 |
| 1037.7 | 0.014 |
| 1037.8 | 0.014 |
| 1037.9 | 0.014 |
| 1038.0 | 0.013 |
| 1038.1 | 0.013 |
| 1038.2 | 0.013 |
| 1038.3 | 0.013 |
| 1038.4 | 0.013 |
| 1038.5 | 0.013 |
| 1038.6 | 0.013 |
| 1038.7 | 0.012 |
| 1038.8 | 0.012 |
| 1038.9 | 0.012 |
| 1039.0 | 0.013 |
| 1039.1 | 0.013 |
| 1039.2 | 0.013 |
| 1039.3 | 0.013 |
| 1039.4 | 0.013 |
| 1039.5 | 0.013 |
| 1039.6 | 0.012 |
| 1039.7 | 0.012 |
| 1039.8 | 0.012 |
| 1039.9 | 0.013 |
| 1040.0 | 0.013 |
| 1040.1 | 0.012 |
| 1040.2 | 0.011 |
| 1040.3 | 0.011 |
| 1040.4 | 0.011 |
| 1040.5 | 0.012 |
| 1040.6 | 0.011 |
| 1040.7 | 0.011 |
| 1040.8 | 0.011 |
| 1040.9 | 0.011 |
| 1041.0 | 0.011 |
| 1041.1 | 0.011 |
| 1041.2 | 0.011 |
| 1041.3 | 0.011 |
| 1041.4 | 0.011 |
| 1041.5 | 0.011 |
| 1041.6 | 0.011 |
| 1041.7 | 0.01 |
| 1041.8 | 0.011 |
| 1041.9 | 0.011 |
| 1042.0 | 0.011 |
| 1042.1 | 0.01 |
| 1042.2 | 0.01 |
| 1042.3 | 0.01 |
| 1042.4 | 0.01 |
| 1042.5 | 0.009 |
| 1042.6 | 0.01 |
| 1042.7 | 0.009 |
| 1042.8 | 0.009 |
| 1042.9 | 0.009 |
| 1043.0 | 0.009 |
| 1043.1 | 0.008 |
| 1043.2 | 0.008 |
| 1043.3 | 0.008 |
| 1043.4 | 0.008 |
| 1043.5 | 0.008 |
| 1043.6 | 0.008 |
| 1043.7 | 0.008 |
| 1043.8 | 0.008 |
| 1043.9 | 0.009 |
| 1044.0 | 0.009 |
| 1044.1 | 0.009 |
| 1044.2 | 0.009 |
| 1044.3 | 0.009 |
| 1044.4 | 0.009 |
| 1044.5 | 0.009 |
| 1044.6 | 0.01 |
| 1044.7 | 0.009 |
| 1044.8 | 0.009 |
| 1044.9 | 0.009 |
| 1045.0 | 0.009 |
| 1045.1 | 0.009 |
| 1045.2 | 0.008 |
| 1045.3 | 0.008 |
| 1045.4 | 0.008 |
| 1045.5 | 0.008 |
| 1045.6 | 0.008 |
| 1045.7 | 0.008 |
| 1045.8 | 0.008 |
| 1045.9 | 0.009 |
| 1046.0 | 0.008 |
| 1046.1 | 0.008 |
| 1046.2 | 0.008 |
| 1046.3 | 0.008 |
| 1046.4 | 0.007 |
| 1046.5 | 0.008 |
| 1046.6 | 0.008 |
| 1046.7 | 0.008 |
| 1046.8 | 0.008 |
| 1046.9 | 0.008 |
| 1047.0 | 0.008 |
| 1047.1 | 0.008 |
| 1047.2 | 0.008 |
| 1047.3 | 0.007 |
| 1047.4 | 0.007 |
| 1047.5 | 0.006 |
| 1047.6 | 0.006 |
| 1047.7 | 0.007 |
| 1047.8 | 0.007 |
| 1047.9 | 0.007 |
| 1048.0 | 0.007 |
| 1048.1 | 0.007 |
| 1048.2 | 0.006 |
| 1048.3 | 0.006 |
| 1048.4 | 0.006 |
| 1048.5 | 0.006 |
| 1048.6 | 0.006 |
| 1048.7 | 0.006 |
| 1048.8 | 0.005 |
| 1048.9 | 0.005 |
| 1049.0 | 0.005 |
| 1049.1 | 0.004 |
| 1049.2 | 0.004 |
| 1049.3 | 0.004 |
| 1049.4 | 0.004 |
| 1049.5 | 0.004 |
| 1049.6 | 0.004 |
| 1049.7 | 0.004 |
| 1049.8 | 0.004 |
| 1049.9 | 0.004 |
| 1050.0 | 0.004 |
| 1050.1 | 0.003 |
| 1050.2 | 0.003 |
| 1050.3 | 0.003 |
| 1050.4 | 0.003 |
| 1050.5 | 0.004 |
| 1050.6 | 0.003 |
| 1050.7 | 0.004 |
| 1050.8 | 0.004 |
| 1050.9 | 0.005 |
| 1051.0 | 0.005 |
| 1051.1 | 0.005 |
| 1051.2 | 0.005 |
| 1051.3 | 0.005 |
| 1051.4 | 0.005 |
| 1051.5 | 0.006 |
| 1051.6 | 0.006 |
| 1051.7 | 0.006 |
| 1051.8 | 0.006 |
| 1051.9 | 0.006 |
| 1052.0 | 0.006 |
| 1052.1 | 0.006 |
| 1052.2 | 0.006 |
| 1052.3 | 0.007 |
| 1052.4 | 0.007 |
| 1052.5 | 0.006 |
| 1052.6 | 0.006 |
| 1052.7 | 0.006 |
| 1052.8 | 0.006 |
| 1052.9 | 0.006 |
| 1053.0 | 0.006 |
| 1053.1 | 0.006 |
| 1053.2 | 0.006 |
| 1053.3 | 0.006 |
| 1053.4 | 0.006 |
| 1053.5 | 0.006 |
| 1053.6 | 0.006 |
| 1053.7 | 0.006 |
| 1053.8 | 0.006 |
| 1053.9 | 0.006 |
| 1054.0 | 0.006 |
| 1054.1 | 0.007 |
| 1054.2 | 0.007 |
| 1054.3 | 0.006 |
| 1054.4 | 0.006 |
| 1054.5 | 0.005 |
| 1054.6 | 0.005 |
| 1054.7 | 0.005 |
| 1054.8 | 0.006 |
| 1054.9 | 0.006 |
| 1055.0 | 0.006 |
| 1055.1 | 0.006 |
| 1055.2 | 0.006 |
| 1055.3 | 0.006 |
| 1055.4 | 0.007 |
| 1055.5 | 0.006 |
| 1055.6 | 0.006 |
| 1055.7 | 0.006 |
| 1055.8 | 0.005 |
| 1055.9 | 0.006 |
| 1056.0 | 0.006 |
| 1056.1 | 0.006 |
| 1056.2 | 0.006 |
| 1056.3 | 0.006 |
| 1056.4 | 0.006 |
| 1056.5 | 0.007 |
| 1056.6 | 0.007 |
| 1056.7 | 0.006 |
| 1056.8 | 0.006 |
| 1056.9 | 0.006 |
| 1057.0 | 0.006 |
| 1057.1 | 0.006 |
| 1057.2 | 0.006 |
| 1057.3 | 0.005 |
| 1057.4 | 0.005 |
| 1057.5 | 0.005 |
| 1057.6 | 0.005 |
| 1057.7 | 0.005 |
| 1057.8 | 0.005 |
| 1057.9 | 0.005 |
| 1058.0 | 0.005 |
| 1058.1 | 0.005 |
| 1058.2 | 0.005 |
| 1058.3 | 0.005 |
| 1058.4 | 0.005 |
| 1058.5 | 0.005 |
| 1058.6 | 0.005 |
| 1058.7 | 0.005 |
| 1058.8 | 0.005 |
| 1058.9 | 0.005 |
| 1059.0 | 0.005 |
| 1059.1 | 0.006 |
| 1059.2 | 0.006 |
| 1059.3 | 0.006 |
| 1059.4 | 0.006 |
| 1059.5 | 0.006 |
| 1059.6 | 0.006 |
| 1059.7 | 0.005 |
| 1059.8 | 0.005 |
| 1059.9 | 0.005 |
| 1060.0 | 0.005 |
| 1060.1 | 0.005 |
| 1060.2 | 0.004 |
| 1060.3 | 0.004 |
| 1060.4 | 0.004 |
| 1060.5 | 0.004 |
| 1060.6 | 0.004 |
| 1060.7 | 0.005 |
| 1060.8 | 0.005 |
| 1060.9 | 0.005 |
| 1061.0 | 0.005 |
| 1061.1 | 0.005 |
| 1061.2 | 0.005 |
| 1061.3 | 0.006 |
| 1061.4 | 0.006 |
| 1061.5 | 0.006 |
| 1061.6 | 0.006 |
| 1061.7 | 0.006 |
| 1061.8 | 0.006 |
| 1061.9 | 0.006 |
| 1062.0 | 0.005 |
| 1062.1 | 0.005 |
| 1062.2 | 0.005 |
| 1062.3 | 0.005 |
| 1062.4 | 0.005 |
| 1062.5 | 0.005 |
| 1062.6 | 0.005 |
| 1062.7 | 0.004 |
| 1062.8 | 0.004 |
| 1062.9 | 0.004 |
| 1063.0 | 0.004 |
| 1063.1 | 0.004 |
| 1063.2 | 0.004 |
| 1063.3 | 0.004 |
| 1063.4 | 0.004 |
| 1063.5 | 0.004 |
| 1063.6 | 0.004 |
| 1063.7 | 0.004 |
| 1063.8 | 0.004 |
| 1063.9 | 0.004 |
| 1064.0 | 0.004 |
| 1064.1 | 0.004 |
| 1064.2 | 0.004 |
| 1064.3 | 0.003 |
| 1064.4 | 0.003 |
| 1064.5 | 0.003 |
| 1064.6 | 0.004 |
| 1064.7 | 0.004 |
| 1064.8 | 0.004 |
| 1064.9 | 0.004 |
| 1065.0 | 0.004 |
| 1065.1 | 0.003 |
| 1065.2 | 0.003 |
| 1065.3 | 0.003 |
| 1065.4 | 0.003 |
| 1065.5 | 0.004 |
| 1065.6 | 0.003 |
| 1065.7 | 0.003 |
| 1065.8 | 0.003 |
| 1065.9 | 0.003 |
| 1066.0 | 0.003 |
| 1066.1 | 0.004 |
| 1066.2 | 0.004 |
| 1066.3 | 0.004 |
| 1066.4 | 0.004 |
| 1066.5 | 0.004 |
| 1066.6 | 0.004 |
| 1066.7 | 0.004 |
| 1066.8 | 0.004 |
| 1066.9 | 0.003 |
| 1067.0 | 0.003 |
| 1067.1 | 0.003 |
| 1067.2 | 0.003 |
| 1067.3 | 0.003 |
| 1067.4 | 0.003 |
| 1067.5 | 0.003 |
| 1067.6 | 0.003 |
| 1067.7 | 0.003 |
| 1067.8 | 0.003 |
| 1067.9 | 0.003 |
| 1068.0 | 0.003 |
| 1068.1 | 0.003 |
| 1068.2 | 0.003 |
| 1068.3 | 0.003 |
| 1068.4 | 0.003 |
| 1068.5 | 0.004 |
| 1068.6 | 0.004 |
| 1068.7 | 0.004 |
| 1068.8 | 0.004 |
| 1068.9 | 0.004 |
| 1069.0 | 0.004 |
| 1069.1 | 0.004 |
| 1069.2 | 0.004 |
| 1069.3 | 0.004 |
| 1069.4 | 0.005 |
| 1069.5 | 0.005 |
| 1069.6 | 0.005 |
| 1069.7 | 0.005 |
| 1069.8 | 0.005 |
| 1069.9 | 0.005 |
| 1070.0 | 0.005 |
| 1070.1 | 0.005 |
| 1070.2 | 0.005 |
| 1070.3 | 0.005 |
| 1070.4 | 0.005 |
| 1070.5 | 0.005 |
| 1070.6 | 0.005 |
| 1070.7 | 0.005 |
| 1070.8 | 0.005 |
| 1070.9 | 0.004 |
| 1071.0 | 0.004 |
| 1071.1 | 0.004 |
| 1071.2 | 0.005 |
| 1071.3 | 0.005 |
| 1071.4 | 0.005 |
| 1071.5 | 0.005 |
| 1071.6 | 0.005 |
| 1071.7 | 0.005 |
| 1071.8 | 0.005 |
| 1071.9 | 0.005 |
| 1072.0 | 0.005 |
| 1072.1 | 0.005 |
| 1072.2 | 0.005 |
| 1072.3 | 0.004 |
| 1072.4 | 0.004 |
| 1072.5 | 0.004 |
| 1072.6 | 0.004 |
| 1072.7 | 0.005 |
| 1072.8 | 0.005 |
| 1072.9 | 0.005 |
| 1073.0 | 0.005 |
| 1073.1 | 0.005 |
| 1073.2 | 0.005 |
| 1073.3 | 0.004 |
| 1073.4 | 0.004 |
| 1073.5 | 0.004 |
| 1073.6 | 0.005 |
| 1073.7 | 0.005 |
| 1073.8 | 0.005 |
| 1073.9 | 0.005 |
| 1074.0 | 0.005 |
| 1074.1 | 0.005 |
| 1074.2 | 0.005 |
| 1074.3 | 0.005 |
| 1074.4 | 0.005 |
| 1074.5 | 0.005 |
| 1074.6 | 0.005 |
| 1074.7 | 0.005 |
| 1074.8 | 0.005 |
| 1074.9 | 0.005 |
| 1075.0 | 0.005 |
| 1075.1 | 0.005 |
| 1075.2 | 0.005 |
| 1075.3 | 0.004 |
| 1075.4 | 0.004 |
| 1075.5 | 0.004 |
| 1075.6 | 0.004 |
| 1075.7 | 0.004 |
| 1075.8 | 0.004 |
| 1075.9 | 0.004 |
| 1076.0 | 0.004 |
| 1076.1 | 0.004 |
| 1076.2 | 0.003 |
| 1076.3 | 0.003 |
| 1076.4 | 0.003 |
| 1076.5 | 0.003 |
| 1076.6 | 0.003 |
| 1076.7 | 0.003 |
| 1076.8 | 0.003 |
| 1076.9 | 0.003 |
| 1077.0 | 0.003 |
| 1077.1 | 0.003 |
| 1077.2 | 0.003 |
| 1077.3 | 0.003 |
| 1077.4 | 0.003 |
| 1077.5 | 0.003 |
| 1077.6 | 0.003 |
| 1077.7 | 0.004 |
| 1077.8 | 0.004 |
| 1077.9 | 0.004 |
| 1078.0 | 0.004 |
| 1078.1 | 0.004 |
| 1078.2 | 0.004 |
| 1078.3 | 0.004 |
| 1078.4 | 0.004 |
| 1078.5 | 0.004 |
| 1078.6 | 0.003 |
| 1078.7 | 0.004 |
| 1078.8 | 0.004 |
| 1078.9 | 0.004 |
| 1079.0 | 0.004 |
| 1079.1 | 0.004 |
| 1079.2 | 0.004 |
| 1079.3 | 0.004 |
| 1079.4 | 0.004 |
| 1079.5 | 0.004 |
| 1079.6 | 0.004 |
| 1079.7 | 0.004 |
| 1079.8 | 0.004 |
| 1079.9 | 0.004 |
| 1080.0 | 0.004 |
| 1080.1 | 0.004 |
| 1080.2 | 0.004 |
| 1080.3 | 0.004 |
| 1080.4 | 0.004 |
| 1080.5 | 0.004 |
| 1080.6 | 0.004 |
| 1080.7 | 0.004 |
| 1080.8 | 0.004 |
| 1080.9 | 0.004 |
| 1081.0 | 0.004 |
| 1081.1 | 0.004 |
| 1081.2 | 0.004 |
| 1081.3 | 0.003 |
| 1081.4 | 0.003 |
| 1081.5 | 0.003 |
| 1081.6 | 0.003 |
| 1081.7 | 0.002 |
| 1081.8 | 0.002 |
| 1081.9 | 0.002 |
| 1082.0 | 0.001 |
| 1082.1 | 0.001 |
| 1082.2 | 0.001 |
| 1082.3 | 0.001 |
| 1082.4 | 0.001 |
| 1082.5 | 0.001 |
| 1082.6 | 0.002 |
| 1082.7 | 0.002 |
| 1082.8 | 0.002 |
| 1082.9 | 0.002 |
| 1083.0 | 0.002 |
| 1083.1 | 0.002 |
| 1083.2 | 0.002 |
| 1083.3 | 0.002 |
| 1083.4 | 0.002 |
| 1083.5 | 0.002 |
| 1083.6 | 0.002 |
| 1083.7 | 0.002 |
| 1083.8 | 0.002 |
| 1083.9 | 0.002 |
| 1084.0 | 0.002 |
| 1084.1 | 0.002 |
| 1084.2 | 0.002 |
| 1084.3 | 0.002 |
| 1084.4 | 0.002 |
| 1084.5 | 0.002 |
| 1084.6 | 0.002 |
| 1084.7 | 0.001 |
| 1084.8 | 0.001 |
| 1084.9 | 0.001 |
| 1085.0 | 0.001 |
| 1085.1 | 0.001 |
| 1085.2 | 0.001 |
| 1085.3 | 0.001 |
| 1085.4 | 0.001 |
| 1085.5 | 0.001 |
| 1085.6 | 0.001 |
| 1085.7 | 0.001 |
| 1085.8 | 0.001 |
| 1085.9 | 0.001 |
| 1086.0 | 0.001 |
| 1086.1 | 0.001 |
| 1086.2 | 0.001 |
| 1086.3 | 0.001 |
| 1086.4 | 0.001 |
| 1086.5 | 0.001 |
| 1086.6 | 0.001 |
| 1086.7 | 0.001 |
| 1086.8 | 0.001 |
| 1086.9 | 0.001 |
| 1087.0 | 0.001 |
| 1087.1 | 0.001 |
| 1087.2 | 0.001 |
| 1087.3 | 0.001 |
| 1087.4 | 0.001 |
| 1087.5 | 0.001 |
| 1087.6 | 0.001 |
| 1087.7 | 0.001 |
| 1087.8 | 0.001 |
| 1087.9 | 0 |
| 1088.0 | 0 |
| 1088.1 | 0 |
| 1088.2 | 0 |
| 1088.3 | 0.001 |
| 1088.4 | 0 |
| 1088.5 | 0 |
| 1088.6 | 0 |
| 1088.7 | 0 |
| 1088.8 | 0 |
| 1088.9 | 0 |
| 1089.0 | 0 |
| 1089.1 | 0 |
| 1089.2 | 0 |
| 1089.3 | 0 |
| 1089.4 | 0.001 |
| 1089.5 | 0.001 |
| 1089.6 | 0.001 |
| 1089.7 | 0.001 |
| 1089.8 | 0.001 |
| 1089.9 | 0.001 |
| 1090.0 | 0.001 |
| 1090.1 | 0.001 |
| 1090.2 | 0.001 |
| 1090.3 | 0.001 |
| 1090.4 | 0.001 |
| 1090.5 | 0.001 |
| 1090.6 | 0.001 |
| 1090.7 | 0 |
| 1090.8 | 0 |
| 1090.9 | 0 |
| 1091.0 | 0 |
| 1091.1 | 0 |
| 1091.2 | 0.001 |
| 1091.3 | 0.001 |
| 1091.4 | 0.001 |
| 1091.5 | 0.001 |
| 1091.6 | 0.001 |
| 1091.7 | 0.001 |
| 1091.8 | 0.002 |
| 1091.9 | 0.002 |
| 1092.0 | 0.002 |
| 1092.1 | 0.002 |
| 1092.2 | 0.002 |
| 1092.3 | 0.002 |
| 1092.4 | 0.002 |
| 1092.5 | 0.002 |
| 1092.6 | 0.002 |
| 1092.7 | 0.002 |
| 1092.8 | 0.002 |
| 1092.9 | 0.002 |
| 1093.0 | 0.002 |
| 1093.1 | 0.002 |
| 1093.2 | 0.002 |
| 1093.3 | 0.002 |
| 1093.4 | 0.002 |
| 1093.5 | 0.002 |
| 1093.6 | 0.002 |
| 1093.7 | 0.002 |
| 1093.8 | 0.002 |
| 1093.9 | 0.002 |
| 1094.0 | 0.002 |
| 1094.1 | 0.002 |
| 1094.2 | 0.002 |
| 1094.3 | 0.002 |
| 1094.4 | 0.002 |
| 1094.5 | 0.002 |
| 1094.6 | 0.002 |
| 1094.7 | 0.002 |
| 1094.8 | 0.002 |
| 1094.9 | 0.002 |
| 1095.0 | 0.002 |
| 1095.1 | 0.002 |
| 1095.2 | 0.002 |
| 1095.3 | 0.002 |
| 1095.4 | 0.001 |
| 1095.5 | 0.001 |
| 1095.6 | 0.001 |
| 1095.7 | 0.001 |
| 1095.8 | 0.001 |
| 1095.9 | 0.001 |
| 1096.0 | 0.001 |
| 1096.1 | 0.001 |
| 1096.2 | 0.001 |
| 1096.3 | 0.001 |
| 1096.4 | 0.001 |
| 1096.5 | 0.001 |
| 1096.6 | 0.001 |
| 1096.7 | 0.001 |
| 1096.8 | 0.002 |
| 1096.9 | 0.002 |
| 1097.0 | 0.002 |
| 1097.1 | 0.002 |
| 1097.2 | 0.002 |
| 1097.3 | 0.001 |
| 1097.4 | 0.001 |
| 1097.5 | 0.001 |
| 1097.6 | 0.001 |
| 1097.7 | 0.001 |
| 1097.8 | 0.001 |
| 1097.9 | 0.001 |
| 1098.0 | 0.001 |
| 1098.1 | 0.001 |
| 1098.2 | 0.001 |
| 1098.3 | 0.001 |
| 1098.4 | 0.001 |
| 1098.5 | 0.001 |
| 1098.6 | 0.001 |
| 1098.7 | 0.001 |
| 1098.8 | 0.001 |
| 1098.9 | 0.001 |
| 1099.0 | 0.001 |
| 1099.1 | 0.001 |
| 1099.2 | 0.001 |
| 1099.3 | 0.001 |
| 1099.4 | 0.001 |
| 1099.5 | 0.001 |
| 1099.6 | 0.001 |
| 1099.7 | 0.001 |
| 1099.8 | 0.001 |
| 1099.9 | 0.001 |
| 1100.0 | 0.001 |